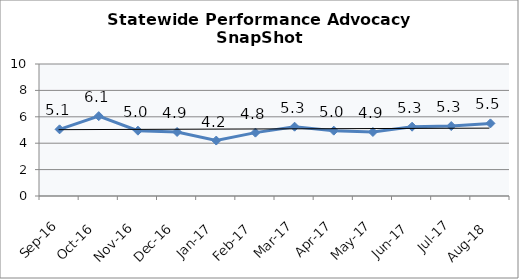
| Category | Statewide |
|---|---|
| Sep-16 | 5.05 |
| Oct-16 | 6.05 |
| Nov-16 | 4.95 |
| Dec-16 | 4.85 |
| Jan-17 | 4.2 |
| Feb-17 | 4.8 |
| Mar-17 | 5.25 |
| Apr-17 | 4.95 |
| May-17 | 4.85 |
| Jun-17 | 5.25 |
| Jul-17 | 5.3 |
| Aug-18 | 5.5 |